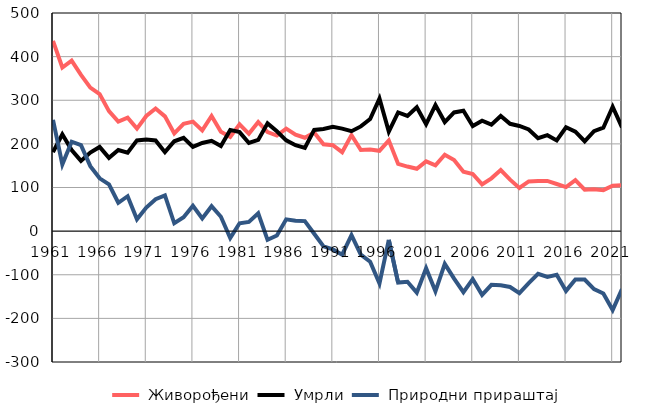
| Category |  Живорођени |  Умрли |  Природни прираштај |
|---|---|---|---|
| 1961.0 | 436 | 181 | 255 |
| 1962.0 | 375 | 222 | 153 |
| 1963.0 | 391 | 186 | 205 |
| 1964.0 | 358 | 161 | 197 |
| 1965.0 | 329 | 180 | 149 |
| 1966.0 | 314 | 193 | 121 |
| 1967.0 | 275 | 168 | 107 |
| 1968.0 | 251 | 186 | 65 |
| 1969.0 | 260 | 180 | 80 |
| 1970.0 | 235 | 208 | 27 |
| 1971.0 | 264 | 210 | 54 |
| 1972.0 | 281 | 208 | 73 |
| 1973.0 | 263 | 181 | 82 |
| 1974.0 | 224 | 206 | 18 |
| 1975.0 | 246 | 214 | 32 |
| 1976.0 | 251 | 193 | 58 |
| 1977.0 | 231 | 202 | 29 |
| 1978.0 | 264 | 207 | 57 |
| 1979.0 | 228 | 195 | 33 |
| 1980.0 | 216 | 232 | -16 |
| 1981.0 | 245 | 227 | 18 |
| 1982.0 | 223 | 202 | 21 |
| 1983.0 | 250 | 209 | 41 |
| 1984.0 | 227 | 247 | -20 |
| 1985.0 | 219 | 229 | -10 |
| 1986.0 | 235 | 208 | 27 |
| 1987.0 | 221 | 197 | 24 |
| 1988.0 | 214 | 191 | 23 |
| 1989.0 | 226 | 232 | -6 |
| 1990.0 | 199 | 234 | -35 |
| 1991.0 | 197 | 239 | -42 |
| 1992.0 | 181 | 235 | -54 |
| 1993.0 | 220 | 229 | -9 |
| 1994.0 | 186 | 240 | -54 |
| 1995.0 | 187 | 257 | -70 |
| 1996.0 | 184 | 304 | -120 |
| 1997.0 | 208 | 228 | -20 |
| 1998.0 | 154 | 272 | -118 |
| 1999.0 | 148 | 264 | -116 |
| 2000.0 | 143 | 284 | -141 |
| 2001.0 | 160 | 245 | -85 |
| 2002.0 | 151 | 289 | -138 |
| 2003.0 | 175 | 250 | -75 |
| 2004.0 | 163 | 272 | -109 |
| 2005.0 | 136 | 276 | -140 |
| 2006.0 | 131 | 241 | -110 |
| 2007.0 | 107 | 253 | -146 |
| 2008.0 | 121 | 244 | -123 |
| 2009.0 | 140 | 264 | -124 |
| 2010.0 | 118 | 246 | -128 |
| 2011.0 | 99 | 241 | -142 |
| 2012.0 | 114 | 233 | -119 |
| 2013.0 | 115 | 213 | -98 |
| 2014.0 | 115 | 220 | -105 |
| 2015.0 | 108 | 208 | -100 |
| 2016.0 | 101 | 238 | -137 |
| 2017.0 | 117 | 228 | -111 |
| 2018.0 | 95 | 206 | -111 |
| 2019.0 | 96 | 229 | -133 |
| 2020.0 | 94 | 237 | -143 |
| 2021.0 | 104 | 285 | -181 |
| 2022.0 | 105 | 238 | -133 |